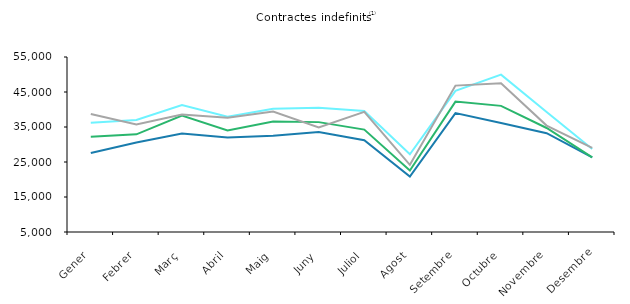
| Category | 2016 | 2017 | 2018 | 2019 |
|---|---|---|---|---|
| Gener | 27560 | 32223 | 36231 | 38693 |
| Febrer | 30550 | 32914 | 37027 | 35737 |
| Març | 33110 | 38286 | 41294 | 38549 |
| Abril | 32010 | 34034 | 37920 | 37614 |
| Maig | 32491 | 36537 | 40183 | 39433 |
| Juny | 33600 | 36393 | 40479 | 34846 |
| Juliol | 31214 | 34255 | 39557 | 39339 |
| Agost | 20830 | 22581 | 27203 | 24205 |
| Setembre | 38971 | 42256 | 45340 | 46822 |
| Octubre | 36152 | 41038 | 49950 | 47518 |
| Novembre | 33233 | 34721 | 39292 | 35408 |
| Desembre | 26313 | 26301 | 28701 | 29034 |